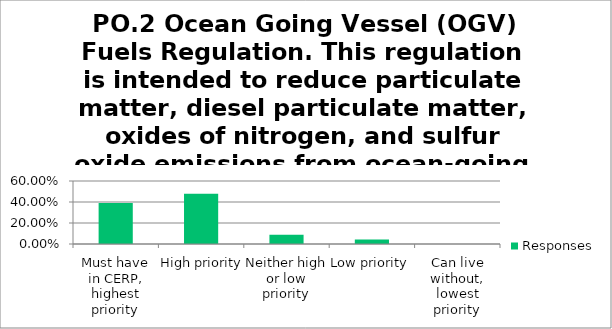
| Category | Responses |
|---|---|
| Must have in CERP, highest priority | 0.391 |
| High priority | 0.478 |
| Neither high or low priority | 0.087 |
| Low priority | 0.044 |
| Can live without, lowest priority | 0 |